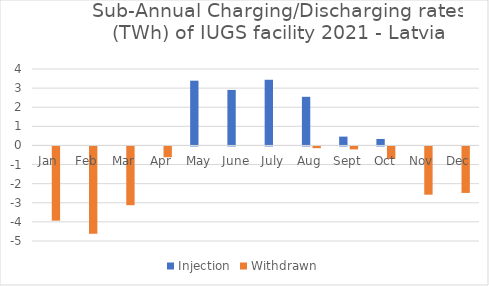
| Category | Injection | Withdrawn |
|---|---|---|
| Jan  | 0 | -3.883 |
| Feb | 0 | -4.569 |
| Mar | 0 | -3.076 |
| Apr | 0 | -0.562 |
| May | 3.389 | 0 |
| June | 2.904 | 0 |
| July | 3.437 | 0 |
| Aug | 2.545 | -0.09 |
| Sept | 0.462 | -0.154 |
| Oct | 0.34 | -0.656 |
| Nov | 0 | -2.524 |
| Dec | 0 | -2.433 |